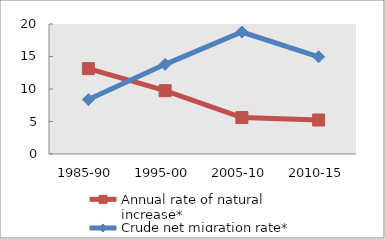
| Category | Annual rate of natural increase* | Crude net migration rate* |
|---|---|---|
| 1985-90 | 13.133 | 8.37 |
| 1995-00 | 9.745 | 13.795 |
| 2005-10 | 5.606 | 18.768 |
| 2010-15 | 5.231 | 14.956 |